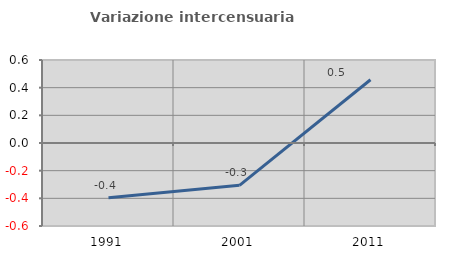
| Category | Variazione intercensuaria annua |
|---|---|
| 1991.0 | -0.396 |
| 2001.0 | -0.306 |
| 2011.0 | 0.457 |